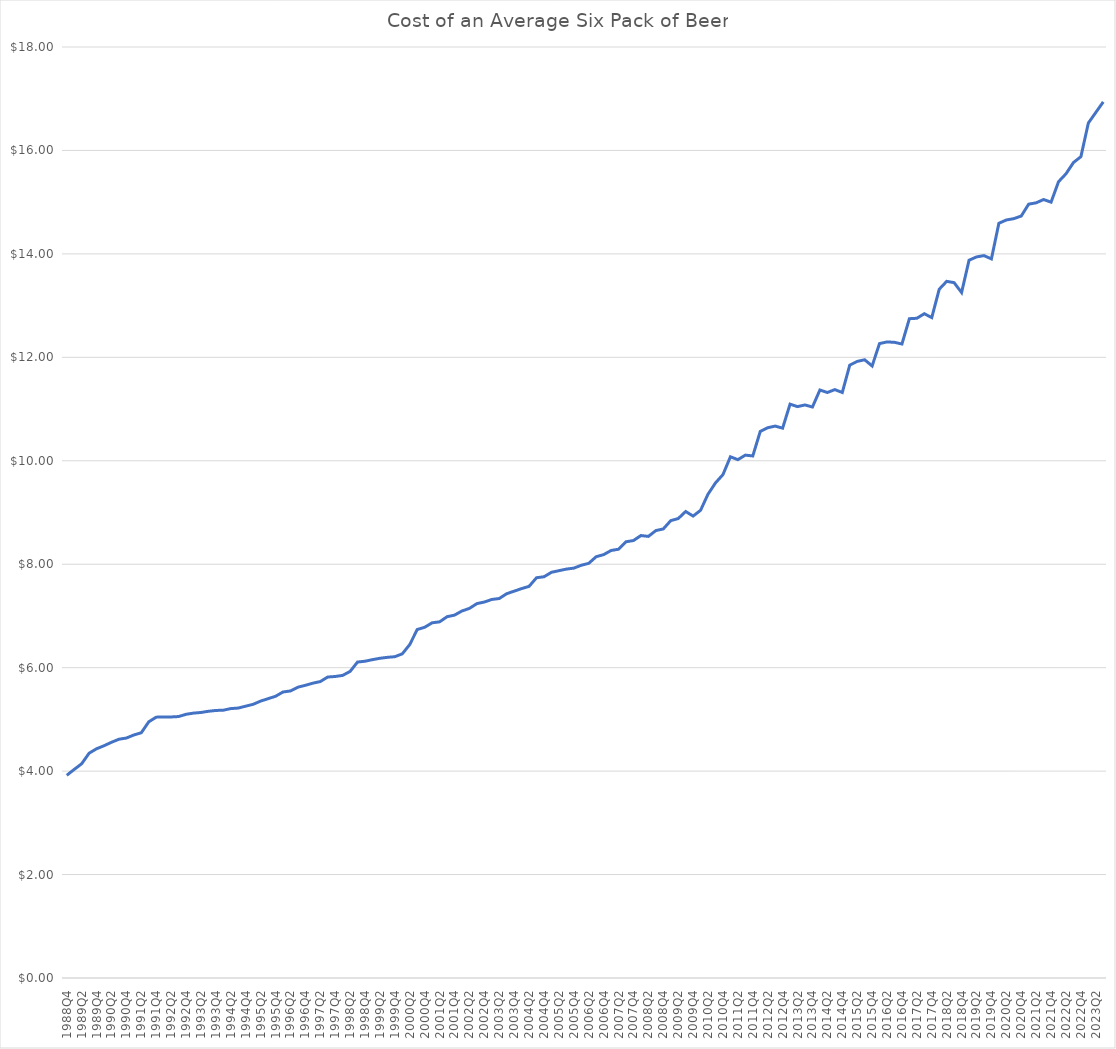
| Category | Series 0 |
|---|---|
| 1988Q4 | 3.919 |
| 1989Q1 | 4.032 |
| 1989Q2 | 4.142 |
| 1989Q3 | 4.346 |
| 1989Q4 | 4.432 |
| 1990Q1 | 4.491 |
| 1990Q2 | 4.557 |
| 1990Q3 | 4.616 |
| 1990Q4 | 4.64 |
| 1991Q1 | 4.698 |
| 1991Q2 | 4.742 |
| 1991Q3 | 4.953 |
| 1991Q4 | 5.043 |
| 1992Q1 | 5.047 |
| 1992Q2 | 5.047 |
| 1992Q3 | 5.055 |
| 1992Q4 | 5.098 |
| 1993Q1 | 5.122 |
| 1993Q2 | 5.133 |
| 1993Q3 | 5.157 |
| 1993Q4 | 5.173 |
| 1994Q1 | 5.178 |
| 1994Q2 | 5.209 |
| 1994Q3 | 5.219 |
| 1994Q4 | 5.255 |
| 1995Q1 | 5.292 |
| 1995Q2 | 5.354 |
| 1995Q3 | 5.4 |
| 1995Q4 | 5.447 |
| 1996Q1 | 5.529 |
| 1996Q2 | 5.55 |
| 1996Q3 | 5.623 |
| 1996Q4 | 5.659 |
| 1997Q1 | 5.7 |
| 1997Q2 | 5.731 |
| 1997Q3 | 5.819 |
| 1997Q4 | 5.829 |
| 1998Q1 | 5.85 |
| 1998Q2 | 5.928 |
| 1998Q3 | 6.109 |
| 1998Q4 | 6.124 |
| 1999Q1 | 6.155 |
| 1999Q2 | 6.181 |
| 1999Q3 | 6.2 |
| 1999Q4 | 6.212 |
| 2000Q1 | 6.268 |
| 2000Q2 | 6.447 |
| 2000Q3 | 6.738 |
| 2000Q4 | 6.781 |
| 2001Q1 | 6.867 |
| 2001Q2 | 6.886 |
| 2001Q3 | 6.985 |
| 2001Q4 | 7.016 |
| 2002Q1 | 7.096 |
| 2002Q2 | 7.145 |
| 2002Q3 | 7.238 |
| 2002Q4 | 7.269 |
| 2003Q1 | 7.319 |
| 2003Q2 | 7.337 |
| 2003Q3 | 7.43 |
| 2003Q4 | 7.479 |
| 2004Q1 | 7.529 |
| 2004Q2 | 7.572 |
| 2004Q3 | 7.739 |
| 2004Q4 | 7.757 |
| 2005Q1 | 7.844 |
| 2005Q2 | 7.875 |
| 2005Q3 | 7.906 |
| 2005Q4 | 7.924 |
| 2006Q1 | 7.98 |
| 2006Q2 | 8.017 |
| 2006Q3 | 8.145 |
| 2006Q4 | 8.185 |
| 2007Q1 | 8.266 |
| 2007Q2 | 8.29 |
| 2007Q3 | 8.434 |
| 2007Q4 | 8.458 |
| 2008Q1 | 8.554 |
| 2008Q2 | 8.538 |
| 2008Q3 | 8.65 |
| 2008Q4 | 8.682 |
| 2009Q1 | 8.843 |
| 2009Q2 | 8.883 |
| 2009Q3 | 9.019 |
| 2009Q4 | 8.931 |
| 2010Q1 | 9.043 |
| 2010Q2 | 9.356 |
| 2010Q3 | 9.572 |
| 2010Q4 | 9.733 |
| 2011Q1 | 10.077 |
| 2011Q2 | 10.021 |
| 2011Q3 | 10.109 |
| 2011Q4 | 10.093 |
| 2012Q1 | 10.566 |
| 2012Q2 | 10.639 |
| 2012Q3 | 10.671 |
| 2012Q4 | 10.631 |
| 2013Q1 | 11.096 |
| 2013Q2 | 11.047 |
| 2013Q3 | 11.08 |
| 2013Q4 | 11.039 |
| 2014Q1 | 11.368 |
| 2014Q2 | 11.32 |
| 2014Q3 | 11.376 |
| 2014Q4 | 11.32 |
| 2015Q1 | 11.849 |
| 2015Q2 | 11.921 |
| 2015Q3 | 11.953 |
| 2015Q4 | 11.833 |
| 2016Q1 | 12.266 |
| 2016Q2 | 12.298 |
| 2016Q3 | 12.29 |
| 2016Q4 | 12.258 |
| 2017Q1 | 12.747 |
| 2017Q2 | 12.755 |
| 2017Q3 | 12.843 |
| 2017Q4 | 12.768 |
| 2018Q1 | 13.316 |
| 2018Q2 | 13.469 |
| 2018Q3 | 13.444 |
| 2018Q4 | 13.253 |
| 2019Q1 | 13.878 |
| 2019Q2 | 13.941 |
| 2019Q3 | 13.967 |
| 2019Q4 | 13.903 |
| 2020Q1 | 14.592 |
| 2020Q2 | 14.656 |
| 2020Q3 | 14.681 |
| 2020Q4 | 14.732 |
| 2021Q1 | 14.962 |
| 2021Q2 | 14.987 |
| 2021Q3 | 15.051 |
| 2021Q4 | 15 |
| 2022Q1 | 15.395 |
| 2022Q2 | 15.548 |
| 2022Q3 | 15.765 |
| 2022Q4 | 15.88 |
| 2023Q1 | 16.531 |
| 2023Q2 | 16.735 |
| 2023Q3 | 16.939 |